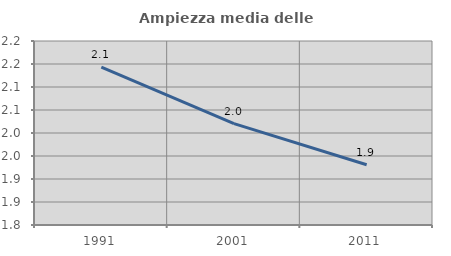
| Category | Ampiezza media delle famiglie |
|---|---|
| 1991.0 | 2.143 |
| 2001.0 | 2.02 |
| 2011.0 | 1.931 |